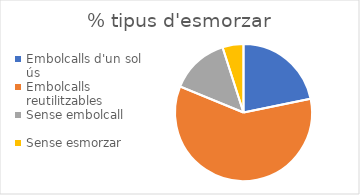
| Category | % |
|---|---|
| Embolcalls d'un sol ús
 | 22 |
| Embolcalls reutilitzables
 | 60 |
| Sense embolcall | 14 |
| Sense esmorzar | 5 |